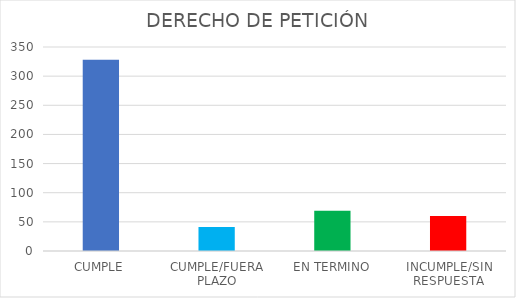
| Category | TOTAL |
|---|---|
| CUMPLE | 328 |
| CUMPLE/FUERA PLAZO | 41 |
| EN TERMINO | 69 |
| INCUMPLE/SIN RESPUESTA | 60 |